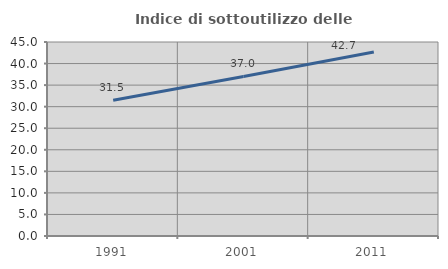
| Category | Indice di sottoutilizzo delle abitazioni  |
|---|---|
| 1991.0 | 31.467 |
| 2001.0 | 37.001 |
| 2011.0 | 42.678 |